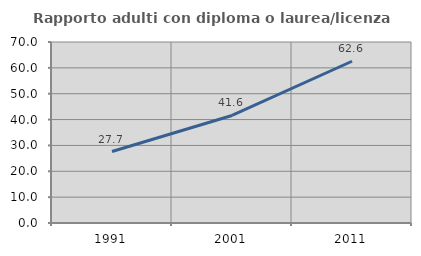
| Category | Rapporto adulti con diploma o laurea/licenza media  |
|---|---|
| 1991.0 | 27.65 |
| 2001.0 | 41.59 |
| 2011.0 | 62.553 |